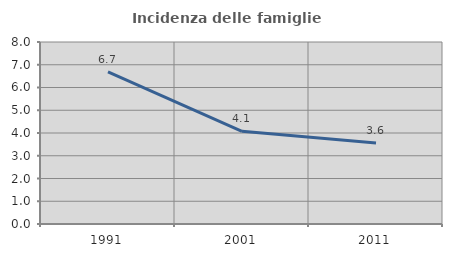
| Category | Incidenza delle famiglie numerose |
|---|---|
| 1991.0 | 6.683 |
| 2001.0 | 4.076 |
| 2011.0 | 3.562 |